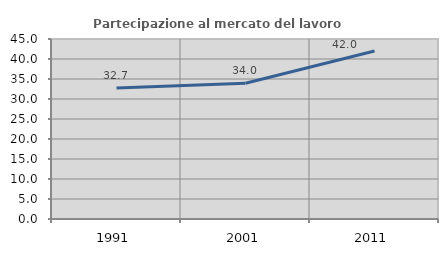
| Category | Partecipazione al mercato del lavoro  femminile |
|---|---|
| 1991.0 | 32.736 |
| 2001.0 | 33.956 |
| 2011.0 | 41.993 |